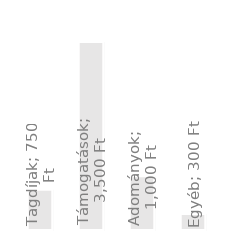
| Category | Éves bevétel |
|---|---|
| Tagdíjak | 750 |
| Támogatások | 3500 |
| Adományok | 1000 |
| Egyéb | 300 |